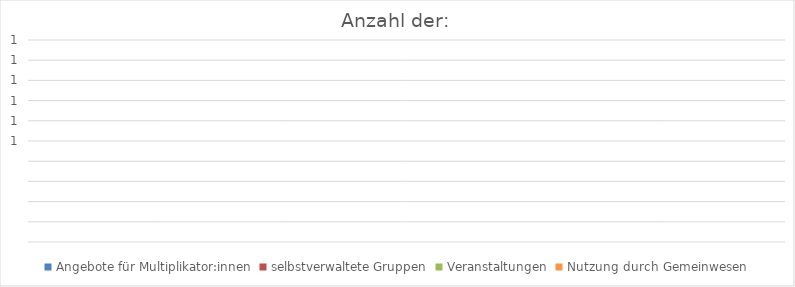
| Category | Angebote für Multiplikator:innen | selbstverwaltete Gruppen | Veranstaltungen | Nutzung durch Gemeinwesen |
|---|---|---|---|---|
| 0 | 0 | 0 | 0 | 0 |